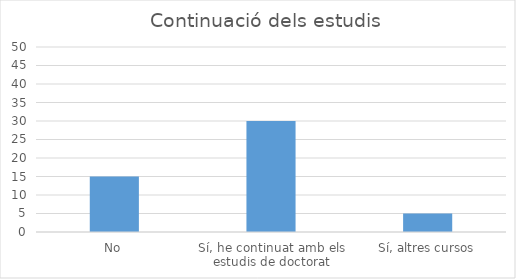
| Category | Series 0 |
|---|---|
| No | 15 |
| Sí, he continuat amb els estudis de doctorat | 30 |
| Sí, altres cursos | 5 |